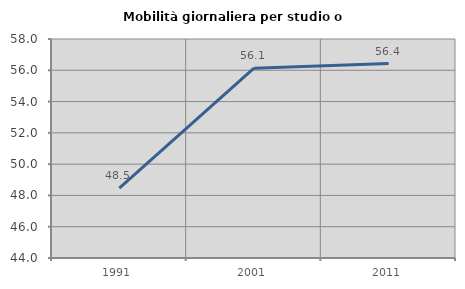
| Category | Mobilità giornaliera per studio o lavoro |
|---|---|
| 1991.0 | 48.469 |
| 2001.0 | 56.137 |
| 2011.0 | 56.427 |